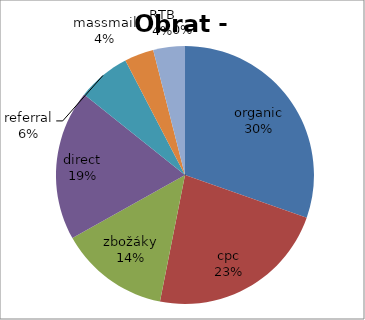
| Category | Series 0 |
|---|---|
| organic | 1741411.326 |
| cpc | 1303238.613 |
| zbožáky | 789571.622 |
| direct | 1079425.153 |
| referral | 380685.352 |
| massmail | 210963.026 |
| RTB | 227356.535 |